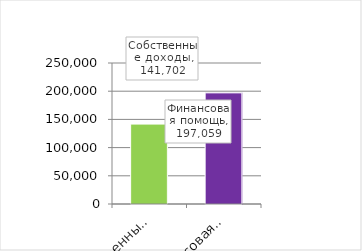
| Category | Series 0 |
|---|---|
| Собственные доходы | 141702 |
| Финансовая помощь | 197059 |